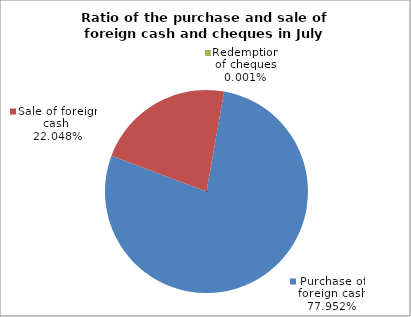
| Category | Purchase of foreign cash |
|---|---|
| 0 | 0.78 |
| 1 | 0.22 |
| 2 | 0 |